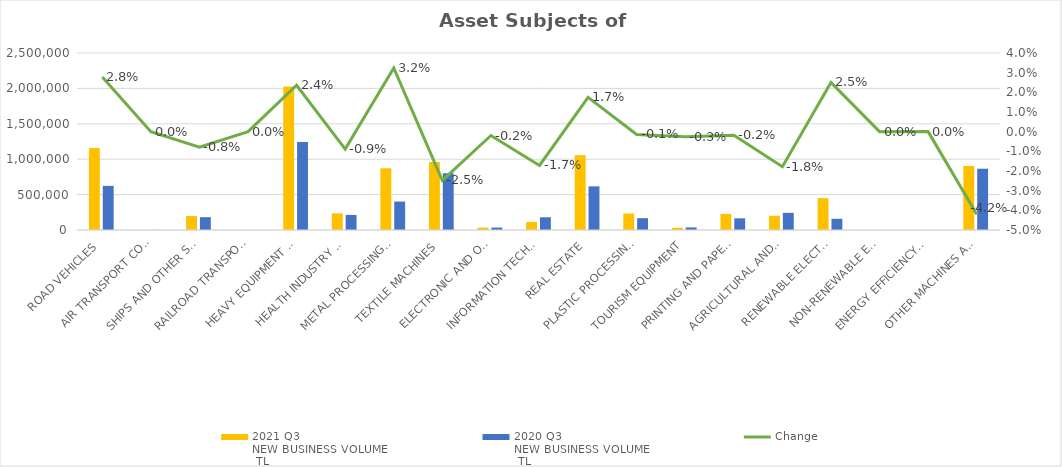
| Category | 2021 Q3 
NEW BUSINESS VOLUME
 TL | 2020 Q3 
NEW BUSINESS VOLUME
 TL |
|---|---|---|
| ROAD VEHICLES | 1156717.996 | 623458.861 |
| AIR TRANSPORT CONVEYANCE | 1756 | 1412.553 |
| SHIPS AND OTHER SEA-GOING VESSELS | 196661.512 | 180851.11 |
| RAILROAD TRANSPORT VEHICLES | 293 | 0 |
| HEAVY EQUIPMENT AND CONSTRUCTION MACHINERY | 2027623.334 | 1241311.898 |
| HEALTH INDUSTRY AND AESTHETIC INSTRUMENTS | 235018.016 | 212464.691 |
| METAL PROCESSING MACHINE | 871717.751 | 401834.152 |
| TEXTILE MACHINES | 960440.65 | 800978.765 |
| ELECTRONIC AND OPTICAL DEVICES | 33864.124 | 34679.181 |
| INFORMATION TECHNOLOGIES AND OFFICE SYSTEMS | 114350.742 | 179786.935 |
| REAL ESTATE | 1056942.081 | 616531.677 |
| PLASTIC PROCESSING MACHINES | 232579.591 | 166795.071 |
| TOURISM EQUIPMENT | 31581.098 | 36736.784 |
| PRINTING AND PAPER PROCESSING MACHINES | 226526.789 | 165249.357 |
| AGRICULTURAL AND LIVESTOCK FARMING MACHINES | 200783.856 | 242189.251 |
| RENEWABLE ELECTRICITY GENERATION | 449903.632 | 157935.2 |
| NON-RENEWABLE ELECTRIC ENERGY GENERATION | 0 | 0 |
| ENERGY EFFICIENCY EQUIPMENT | 186.993 | 0 |
| OTHER MACHINES AND EQUIPMENT | 904989.293 | 865622.419 |